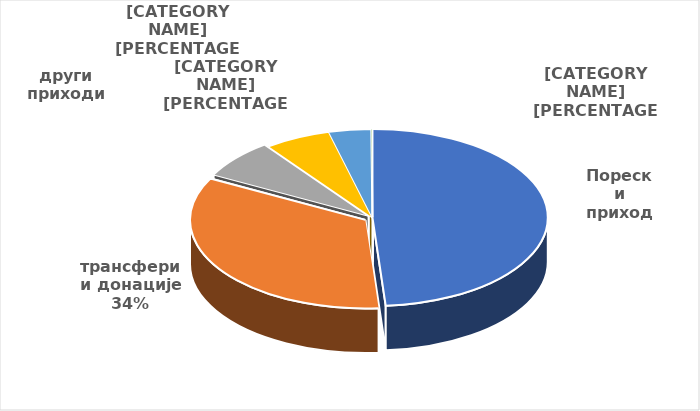
| Category | Series 0 |
|---|---|
| Порески приходи | 316126000 |
| трансфери и донације | 219968000 |
| други приходи | 46363000 |
| примања од продаје нефинансијске имовине | 39479000 |
| примања од продаје финансијске имовине / задуживања | 25257000 |
| меморандумске ставке  | 684000 |